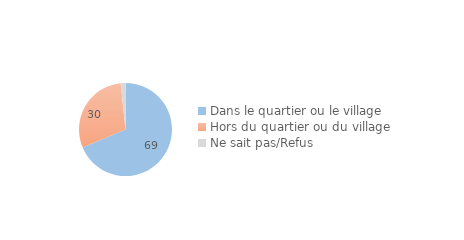
| Category | Series 0 |
|---|---|
| Dans le quartier ou le village | 68.683 |
| Hors du quartier ou du village | 29.652 |
| Ne sait pas/Refus | 1.666 |